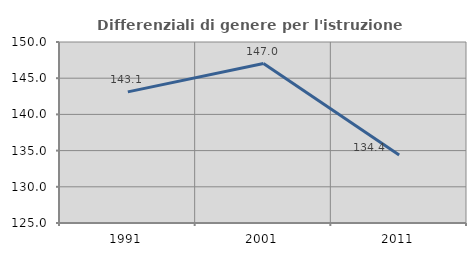
| Category | Differenziali di genere per l'istruzione superiore |
|---|---|
| 1991.0 | 143.114 |
| 2001.0 | 147.021 |
| 2011.0 | 134.404 |